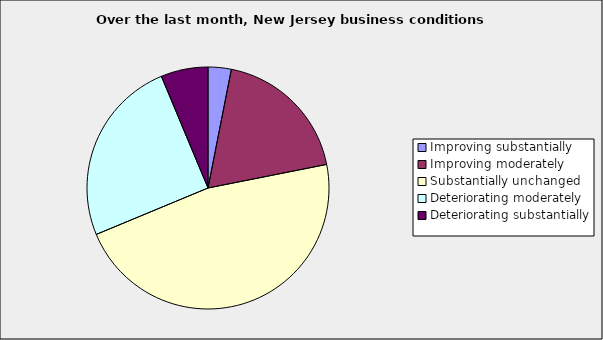
| Category | Series 0 |
|---|---|
| Improving substantially | 0.031 |
| Improving moderately | 0.188 |
| Substantially unchanged | 0.469 |
| Deteriorating moderately | 0.25 |
| Deteriorating substantially | 0.063 |